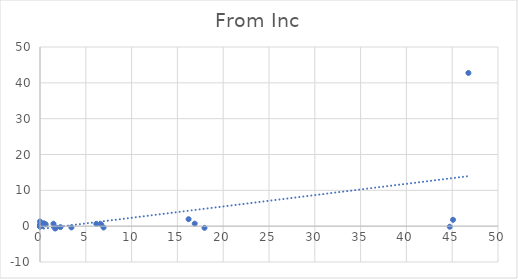
| Category | Series 0 |
|---|---|
| 44.73 | -0.161 |
| 17.96 | -0.463 |
| 6.94 | -0.375 |
| 3.43 | -0.349 |
| 2.23 | -0.27 |
| 1.76 | -0.407 |
| 0.0 | 1.316 |
| 0.0 | 0 |
| 45.09 | 1.775 |
| 16.89 | 0.706 |
| 6.15 | 0.646 |
| 1.47 | 0.669 |
| 0.43 | 0.789 |
| 0.1 | 0.21 |
| 0.0 | 0.027 |
| 0.0 | 0 |
| 46.77 | 42.763 |
| 16.22 | 1.939 |
| 6.66 | 0.531 |
| 1.65 | -0.657 |
| 0.62 | 0.528 |
| 0.17 | 0.02 |
| 0.0 | 0.434 |
| 0.0 | 0 |